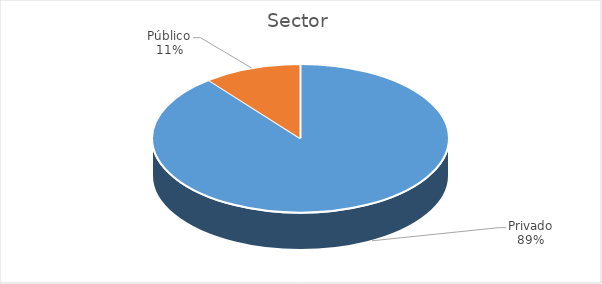
| Category | Total |
|---|---|
| Privado | 42 |
| Público | 5 |